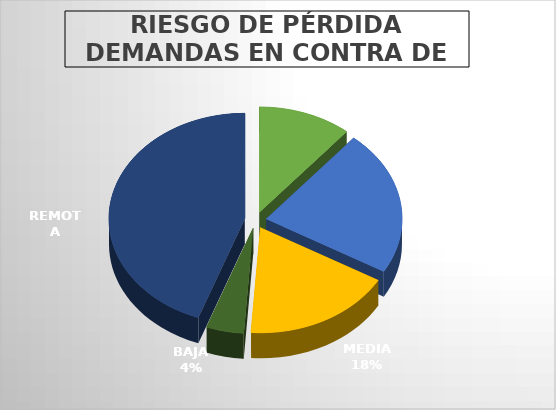
| Category | Series 0 |
|---|---|
| #N/A | 5 |
| ALTA | 10 |
| MEDIA | 8 |
| BAJA | 2 |
| REMOTA | 20 |